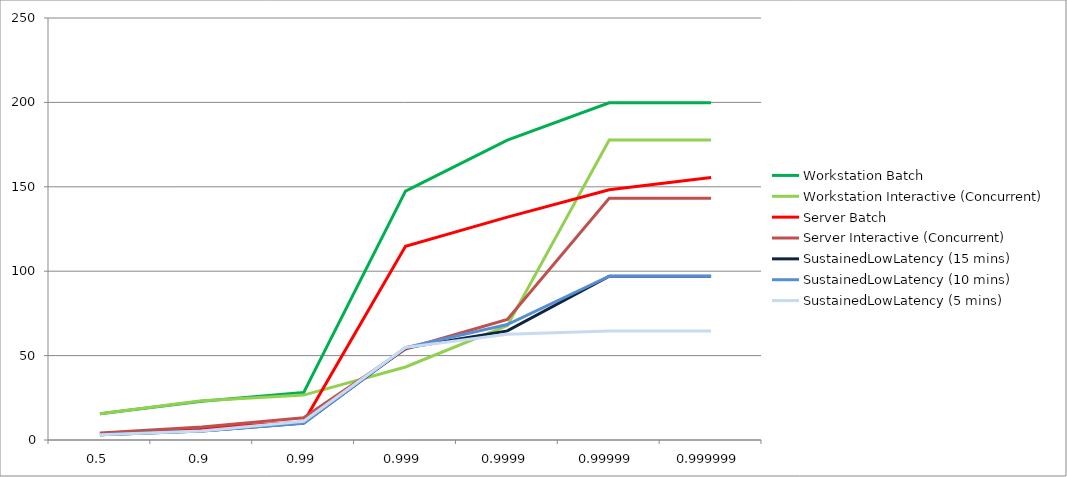
| Category | Workstation Batch | Workstation Interactive (Concurrent) | Server Batch | Server Interactive (Concurrent) | SustainedLowLatency (15 mins) | SustainedLowLatency (10 mins) | SustainedLowLatency (5 mins) |
|---|---|---|---|---|---|---|---|
| 0.5 | 15.598 | 15.598 | 3.721 | 4.145 | 3.072 | 3.09 | 3.095 |
| 0.9 | 22.954 | 23.233 | 6.894 | 7.758 | 5.308 | 5.333 | 5.403 |
| 0.99 | 28.099 | 26.591 | 10.641 | 13.206 | 10.109 | 9.945 | 11.108 |
| 0.999 | 147.456 | 43.254 | 114.754 | 53.936 | 54.526 | 54.723 | 54.821 |
| 0.9999 | 177.603 | 67.764 | 132.055 | 71.434 | 64.618 | 68.42 | 62.587 |
| 0.99999 | 199.754 | 177.734 | 148.242 | 143.262 | 97.059 | 97.059 | 64.618 |
| 0.999999 | 199.754 | 177.734 | 155.451 | 143.262 | 97.059 | 97.059 | 64.618 |